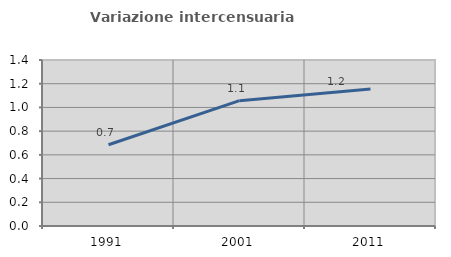
| Category | Variazione intercensuaria annua |
|---|---|
| 1991.0 | 0.685 |
| 2001.0 | 1.057 |
| 2011.0 | 1.156 |